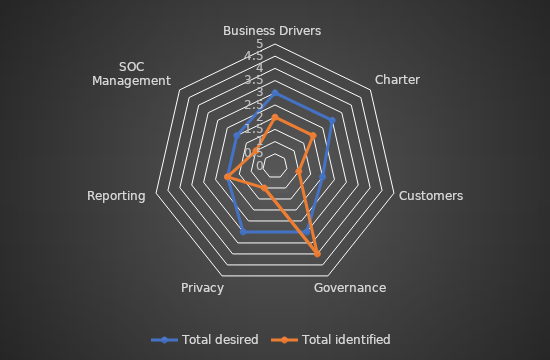
| Category | Total desired | Total identified |
|---|---|---|
| 0 | 3 | 2 |
| 1 | 3 | 2 |
| 2 | 2 | 1 |
| 3 | 3 | 4 |
| 4 | 3 | 1 |
| 5 | 2 | 2 |
| 6 | 2 | 1 |